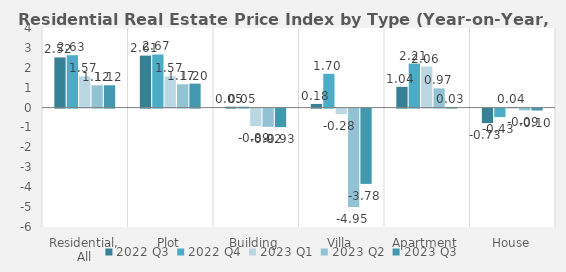
| Category | 2022 | 2023 |
|---|---|---|
| Residential, All | 2.634 | 1.121 |
| Plot | 2.669 | 1.204 |
| Building | 0.046 | -0.931 |
| Villa | 1.697 | -3.784 |
| Apartment | 2.211 | 0.033 |
| House | -0.427 | -0.096 |